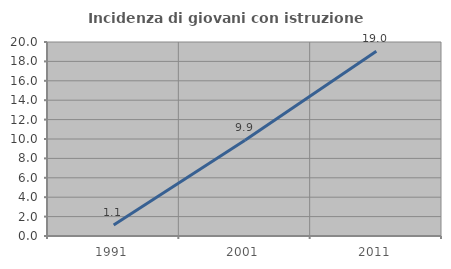
| Category | Incidenza di giovani con istruzione universitaria |
|---|---|
| 1991.0 | 1.124 |
| 2001.0 | 9.877 |
| 2011.0 | 19.048 |